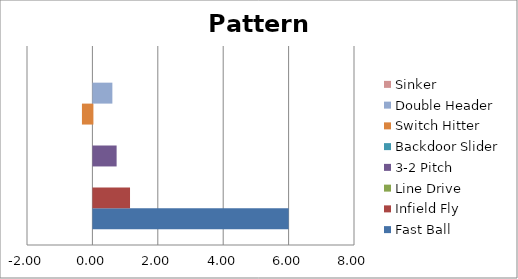
| Category | Fast Ball | Infield Fly | Line Drive | 3-2 Pitch | Backdoor Slider | Switch Hitter | Double Header | Sinker |
|---|---|---|---|---|---|---|---|---|
| 0 | 5.97 | 1.12 | 0 | 0.71 | 0 | -0.32 | 0.58 | 0 |